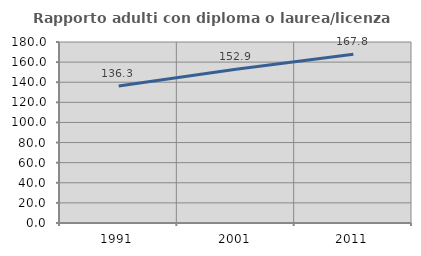
| Category | Rapporto adulti con diploma o laurea/licenza media  |
|---|---|
| 1991.0 | 136.332 |
| 2001.0 | 152.86 |
| 2011.0 | 167.78 |